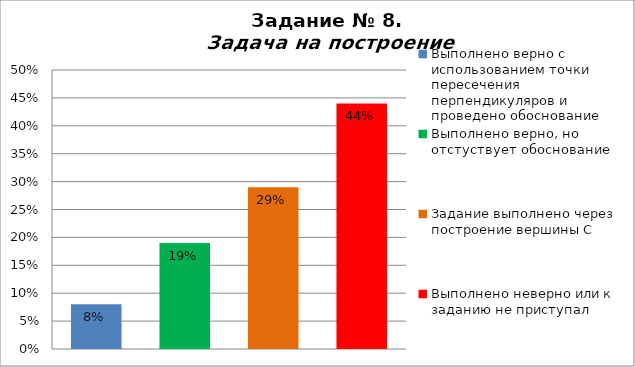
| Category | Задача на построение |
|---|---|
| Выполнено верно с использованием точки пересечения перпендикуляров и проведено обоснование | 0.08 |
| Выполнено верно, но отстуствует обоснование | 0.19 |
| Задание выполнено через построение вершины С | 0.29 |
| Выполнено неверно или к заданию не приступал | 0.44 |